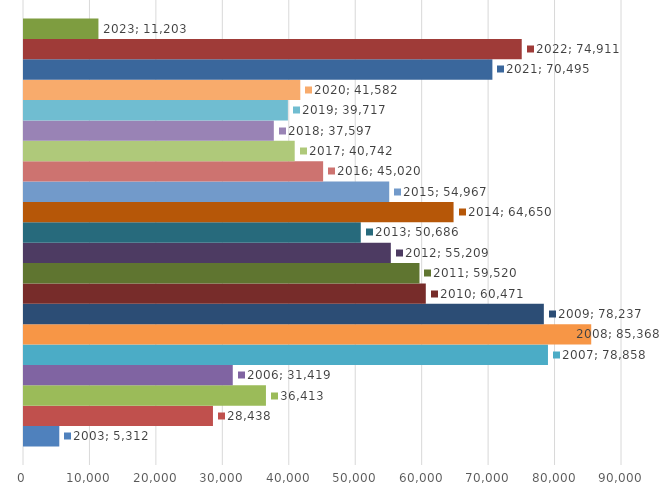
| Category | 2003 | 2004 | 2005 | 2006 | 2007 | 2008 | 2009 | 2010 | 2011 | 2012 | 2013 | 2014 | 2015 | 2016 | 2017 | 2018 | 2019 | 2020 | 2021 | 2022 | 2023 |
|---|---|---|---|---|---|---|---|---|---|---|---|---|---|---|---|---|---|---|---|---|---|
| 0 | 5312 | 28438 | 36413 | 31419 | 78858 | 85368 | 78237 | 60471 | 59520 | 55209 | 50686 | 64650 | 54967 | 45020 | 40742 | 37597 | 39717 | 41582 | 70495 | 74911 | 11203 |